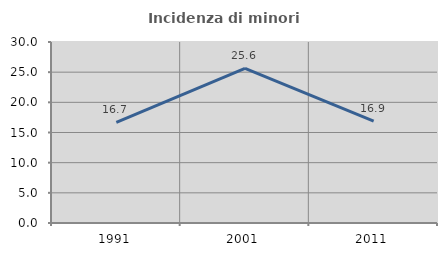
| Category | Incidenza di minori stranieri |
|---|---|
| 1991.0 | 16.667 |
| 2001.0 | 25.641 |
| 2011.0 | 16.875 |